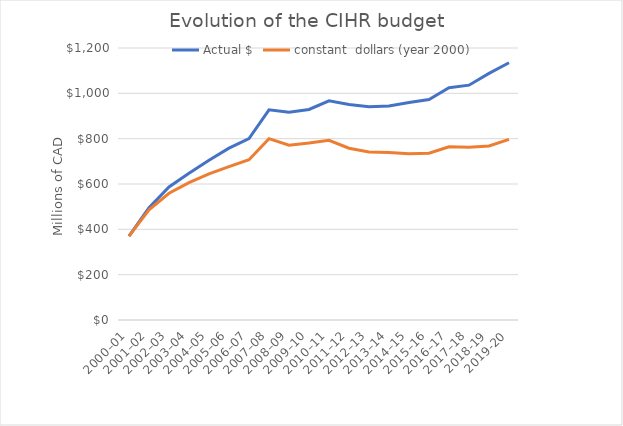
| Category | Actual $ | constant  dollars (year 2000) |
|---|---|---|
| 2000–01 | 370 | 370 |
| 2001–02 | 495 | 486 |
| 2002–03 | 587 | 559 |
| 2003–04 | 647 | 606 |
| 2004–05 | 705 | 645 |
| 2005–06 | 758 | 677 |
| 2006–07 | 800 | 707 |
| 2007–08 | 927 | 800 |
| 2008–09 | 917 | 771 |
| 2009–10 | 929 | 781 |
| 2010–11 | 967 | 793 |
| 2011–12 | 951 | 758 |
| 2012–13 | 941 | 741 |
| 2013–14 | 944 | 739 |
| 2014–15 | 960 | 734 |
| 2015–16 | 973 | 736 |
| 2016–17 | 1025 | 764 |
| 2017–18 | 1036 | 762 |
| 2018-19 | 1088 | 768 |
| 2019-20 | 1135 | 797 |